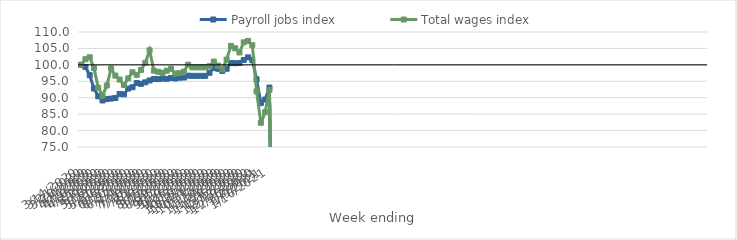
| Category | Payroll jobs index | Total wages index |
|---|---|---|
| 14/03/2020 | 100 | 100 |
| 21/03/2020 | 99.366 | 101.723 |
| 28/03/2020 | 96.871 | 102.315 |
| 04/04/2020 | 92.796 | 99.016 |
| 11/04/2020 | 90.434 | 93.036 |
| 18/04/2020 | 89.152 | 90.631 |
| 25/04/2020 | 89.579 | 93.716 |
| 02/05/2020 | 89.735 | 98.875 |
| 09/05/2020 | 89.93 | 96.721 |
| 16/05/2020 | 91.154 | 95.528 |
| 23/05/2020 | 91.034 | 93.853 |
| 30/05/2020 | 92.775 | 95.898 |
| 06/06/2020 | 93.19 | 97.743 |
| 13/06/2020 | 94.469 | 96.937 |
| 20/06/2020 | 94.222 | 98.468 |
| 27/06/2020 | 94.68 | 100.652 |
| 04/07/2020 | 95.25 | 104.448 |
| 11/07/2020 | 95.712 | 98.243 |
| 18/07/2020 | 95.648 | 97.891 |
| 25/07/2020 | 95.81 | 97.578 |
| 01/08/2020 | 95.74 | 98.219 |
| 08/08/2020 | 96.011 | 98.8 |
| 15/08/2020 | 95.848 | 97.365 |
| 22/08/2020 | 96.086 | 97.502 |
| 29/08/2020 | 96.147 | 97.952 |
| 05/09/2020 | 96.708 | 100.062 |
| 12/09/2020 | 96.653 | 99.241 |
| 19/09/2020 | 96.653 | 99.241 |
| 26/09/2020 | 96.653 | 99.241 |
| 03/10/2020 | 96.653 | 99.241 |
| 10/10/2020 | 97.581 | 99.567 |
| 17/10/2020 | 99.052 | 101.006 |
| 24/10/2020 | 98.798 | 99.766 |
| 31/10/2020 | 98.142 | 98.652 |
| 07/11/2020 | 98.804 | 101.592 |
| 14/11/2020 | 100.568 | 105.771 |
| 21/11/2020 | 100.49 | 105.037 |
| 28/11/2020 | 100.567 | 103.775 |
| 05/12/2020 | 101.486 | 106.867 |
| 12/12/2020 | 102.274 | 107.286 |
| 19/12/2020 | 101.429 | 105.981 |
| 26/12/2020 | 95.592 | 91.945 |
| 02/01/2021 | 88.344 | 82.364 |
| 09/01/2021 | 89.442 | 85.584 |
| 16/01/2021 | 93.097 | 92.351 |